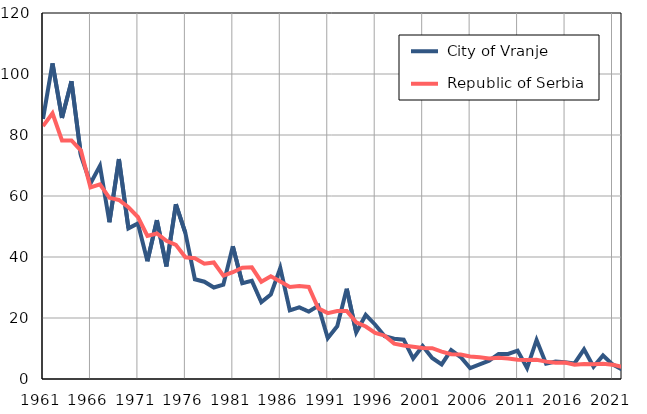
| Category |  City of Vranje |  Republic of Serbia |
|---|---|---|
| 1961.0 | 85.3 | 82.9 |
| 1962.0 | 103.5 | 87.1 |
| 1963.0 | 85.6 | 78.2 |
| 1964.0 | 97.6 | 78.2 |
| 1965.0 | 73.2 | 74.9 |
| 1966.0 | 64.1 | 62.8 |
| 1967.0 | 69.9 | 63.8 |
| 1968.0 | 51.4 | 59.4 |
| 1969.0 | 72.1 | 58.7 |
| 1970.0 | 49.4 | 56.3 |
| 1971.0 | 51 | 53.1 |
| 1972.0 | 38.6 | 46.9 |
| 1973.0 | 52.1 | 47.7 |
| 1974.0 | 36.9 | 45.3 |
| 1975.0 | 57.3 | 44 |
| 1976.0 | 47.9 | 39.9 |
| 1977.0 | 32.7 | 39.6 |
| 1978.0 | 31.9 | 37.8 |
| 1979.0 | 30 | 38.2 |
| 1980.0 | 30.9 | 33.9 |
| 1981.0 | 43.5 | 35 |
| 1982.0 | 31.4 | 36.5 |
| 1983.0 | 32.2 | 36.6 |
| 1984.0 | 25.2 | 31.9 |
| 1985.0 | 27.7 | 33.7 |
| 1986.0 | 36.4 | 32 |
| 1987.0 | 22.5 | 30.2 |
| 1988.0 | 23.5 | 30.5 |
| 1989.0 | 22.1 | 30.2 |
| 1990.0 | 24 | 23.2 |
| 1991.0 | 13.4 | 21.6 |
| 1992.0 | 17.3 | 22.3 |
| 1993.0 | 29.6 | 22.3 |
| 1994.0 | 15.3 | 18.6 |
| 1995.0 | 21 | 17.2 |
| 1996.0 | 17.8 | 15.1 |
| 1997.0 | 14 | 14.2 |
| 1998.0 | 13.2 | 11.6 |
| 1999.0 | 12.9 | 11 |
| 2000.0 | 6.7 | 10.6 |
| 2001.0 | 10.8 | 10.2 |
| 2002.0 | 6.9 | 10.1 |
| 2003.0 | 4.8 | 9 |
| 2004.0 | 9.5 | 8.1 |
| 2005.0 | 7.2 | 8 |
| 2006.0 | 3.6 | 7.4 |
| 2007.0 | 4.8 | 7.1 |
| 2008.0 | 6 | 6.7 |
| 2009.0 | 8.2 | 7 |
| 2010.0 | 8.2 | 6.7 |
| 2011.0 | 9.3 | 6.3 |
| 2012.0 | 3.6 | 6.2 |
| 2013.0 | 12.8 | 6.3 |
| 2014.0 | 5 | 5.7 |
| 2015.0 | 5.7 | 5.3 |
| 2016.0 | 5.5 | 5.4 |
| 2017.0 | 5.1 | 4.7 |
| 2018.0 | 9.7 | 4.9 |
| 2019.0 | 4 | 4.8 |
| 2020.0 | 7.7 | 5 |
| 2021.0 | 4.8 | 4.7 |
| 2022.0 | 3.1 | 4 |